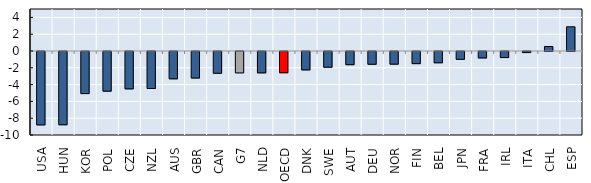
| Category | Median to average ratio |
|---|---|
| USA | -8.738 |
| HUN | -8.721 |
| KOR | -5.011 |
| POL | -4.722 |
| CZE | -4.447 |
| NZL | -4.404 |
| AUS | -3.252 |
| GBR | -3.157 |
| CAN | -2.594 |
| G7 | -2.547 |
| NLD | -2.543 |
| OECD | -2.529 |
| DNK | -2.19 |
| SWE | -1.874 |
| AUT | -1.571 |
| DEU | -1.52 |
| NOR | -1.507 |
| FIN | -1.445 |
| BEL | -1.342 |
| JPN | -0.929 |
| FRA | -0.768 |
| IRL | -0.722 |
| ITA | -0.126 |
| CHL | 0.539 |
| ESP | 2.882 |